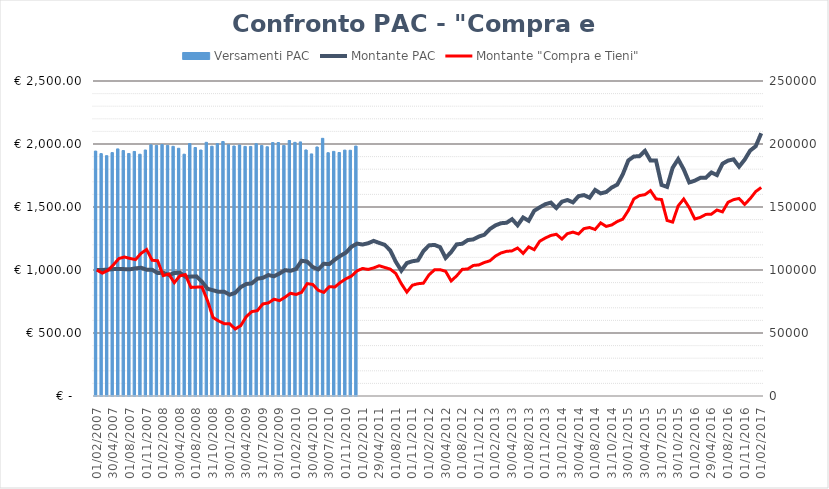
| Category |  Versamenti PAC  |
|---|---|
| 01/02/2007 | 1944.005 |
| 01/03/2007 | 1923.698 |
| 30/03/2007 | 1907.422 |
| 30/04/2007 | 1931.88 |
| 01/06/2007 | 1961.136 |
| 29/06/2007 | 1947.92 |
| 01/08/2007 | 1924.652 |
| 31/08/2007 | 1940.782 |
| 01/10/2007 | 1918.987 |
| 01/11/2007 | 1952.427 |
| 30/11/2007 | 1993.457 |
| 31/12/2007 | 1988.623 |
| 01/02/2008 | 1995.247 |
| 29/02/2008 | 1988.925 |
| 01/04/2008 | 1981.412 |
| 30/04/2008 | 1966.101 |
| 30/05/2008 | 1918.964 |
| 01/07/2008 | 2003.676 |
| 01/08/2008 | 1972.204 |
| 01/09/2008 | 1952.378 |
| 01/10/2008 | 2013.33 |
| 31/10/2008 | 1982.277 |
| 01/12/2008 | 2002.676 |
| 31/12/2008 | 2019.958 |
| 30/01/2009 | 1994.113 |
| 27/02/2009 | 1983.963 |
| 01/04/2009 | 1991.928 |
| 30/04/2009 | 1980.8 |
| 01/06/2009 | 1980.674 |
| 01/07/2009 | 2002.29 |
| 31/07/2009 | 1987.919 |
| 01/09/2009 | 1978.055 |
| 01/10/2009 | 2011.427 |
| 30/10/2009 | 2011.727 |
| 01/12/2009 | 1988.654 |
| 31/12/2009 | 2027.565 |
| 01/02/2010 | 2013.123 |
| 01/03/2010 | 2016.507 |
| 01/04/2010 | 1952.777 |
| 30/04/2010 | 1921.265 |
| 01/06/2010 | 1976.469 |
| 01/07/2010 | 2045.068 |
| 30/07/2010 | 1930.844 |
| 01/09/2010 | 1941.53 |
| 01/10/2010 | 1932.618 |
| 01/11/2010 | 1951.621 |
| 01/12/2010 | 1950.365 |
| 31/12/2010 | 1983.65 |
| 01/02/2011 | 0 |
| 01/03/2011 | 0 |
| 01/04/2011 | 0 |
| 29/04/2011 | 0 |
| 01/06/2011 | 0 |
| 01/07/2011 | 0 |
| 01/08/2011 | 0 |
| 01/09/2011 | 0 |
| 30/09/2011 | 0 |
| 01/11/2011 | 0 |
| 01/12/2011 | 0 |
| 30/12/2011 | 0 |
| 01/02/2012 | 0 |
| 01/03/2012 | 0 |
| 30/03/2012 | 0 |
| 30/04/2012 | 0 |
| 01/06/2012 | 0 |
| 29/06/2012 | 0 |
| 01/08/2012 | 0 |
| 31/08/2012 | 0 |
| 01/10/2012 | 0 |
| 01/11/2012 | 0 |
| 30/11/2012 | 0 |
| 31/12/2012 | 0 |
| 01/02/2013 | 0 |
| 01/03/2013 | 0 |
| 28/03/2013 | 0 |
| 30/04/2013 | 0 |
| 31/05/2013 | 0 |
| 01/07/2013 | 0 |
| 01/08/2013 | 0 |
| 30/08/2013 | 0 |
| 01/10/2013 | 0 |
| 01/11/2013 | 0 |
| 29/11/2013 | 0 |
| 31/12/2013 | 0 |
| 31/01/2014 | 0 |
| 28/02/2014 | 0 |
| 01/04/2014 | 0 |
| 30/04/2014 | 0 |
| 30/05/2014 | 0 |
| 01/07/2014 | 0 |
| 01/08/2014 | 0 |
| 01/09/2014 | 0 |
| 01/10/2014 | 0 |
| 31/10/2014 | 0 |
| 01/12/2014 | 0 |
| 31/12/2014 | 0 |
| 30/01/2015 | 0 |
| 27/02/2015 | 0 |
| 01/04/2015 | 0 |
| 30/04/2015 | 0 |
| 01/06/2015 | 0 |
| 01/07/2015 | 0 |
| 31/07/2015 | 0 |
| 01/09/2015 | 0 |
| 01/10/2015 | 0 |
| 30/10/2015 | 0 |
| 01/12/2015 | 0 |
| 31/12/2015 | 0 |
| 01/02/2016 | 0 |
| 01/03/2016 | 0 |
| 01/04/2016 | 0 |
| 29/04/2016 | 0 |
| 01/06/2016 | 0 |
| 01/07/2016 | 0 |
| 01/08/2016 | 0 |
| 01/09/2016 | 0 |
| 30/09/2016 | 0 |
| 01/11/2016 | 0 |
| 01/12/2016 | 0 |
| 30/12/2016 | 0 |
| 01/02/2017 | 0 |